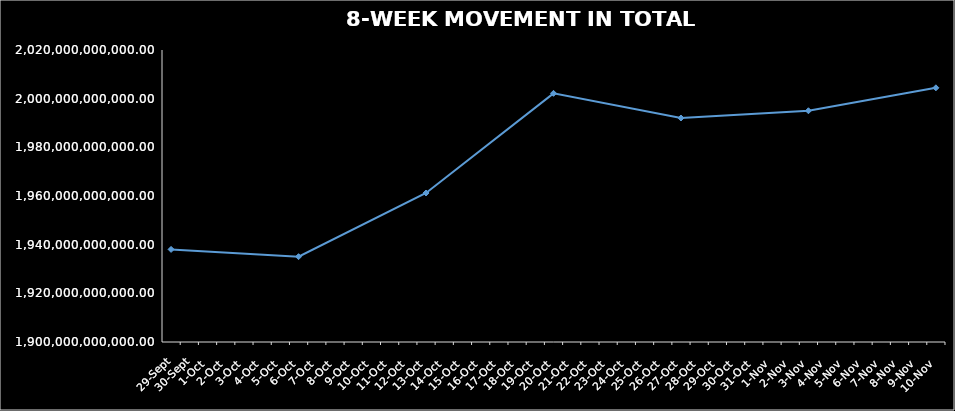
| Category | TOTAL NAV |
|---|---|
| 2023-09-29 | 1938057005087.285 |
| 2023-10-06 | 1935067759050.206 |
| 2023-10-13 | 1961229345082.933 |
| 2023-10-20 | 2002190167303.245 |
| 2023-10-27 | 1992052361749.948 |
| 2023-11-03 | 1995029350611.796 |
| 2023-11-10 | 2004454649356.778 |